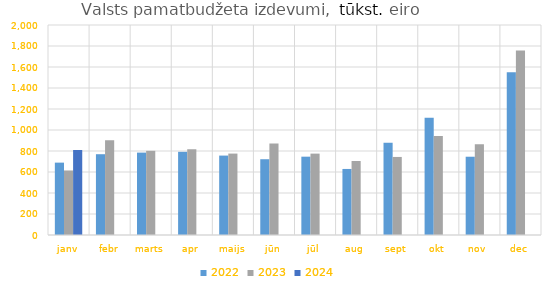
| Category | 2022 | 2023 | 2024 |
|---|---|---|---|
| janv | 689237.965 | 614585.632 | 809894.408 |
| febr | 769410.975 | 903091.852 | 0 |
| marts | 784728.56 | 801670.588 | 0 |
| apr | 792151.693 | 815830.901 | 0 |
| maijs | 756370.204 | 775435.197 | 0 |
| jūn | 721608.297 | 872192.844 | 0 |
| jūl | 745948.556 | 775102.307 | 0 |
| aug | 628998.795 | 704584.156 | 0 |
| sept | 879428.128 | 743373.689 | 0 |
| okt | 1117520.592 | 943256.707 | 0 |
| nov | 745480.917 | 864698.939 | 0 |
| dec | 1550280.295 | 1757604.888 | 0 |